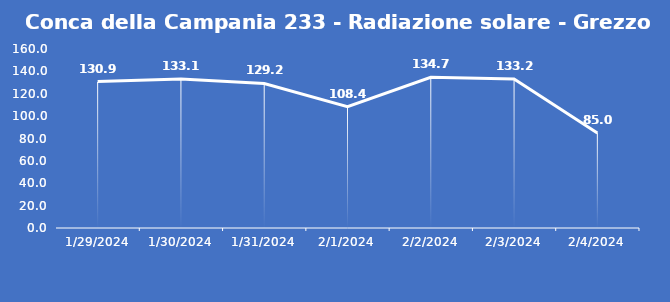
| Category | Conca della Campania 233 - Radiazione solare - Grezzo (W/m2) |
|---|---|
| 1/29/24 | 130.9 |
| 1/30/24 | 133.1 |
| 1/31/24 | 129.2 |
| 2/1/24 | 108.4 |
| 2/2/24 | 134.7 |
| 2/3/24 | 133.2 |
| 2/4/24 | 85 |